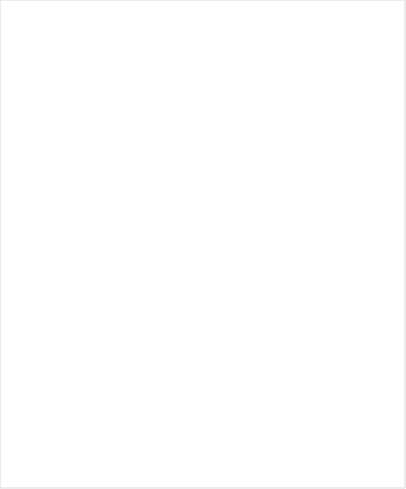
| Category | Series 0 |
|---|---|
| JA | 0 |
| NEI | 0 |